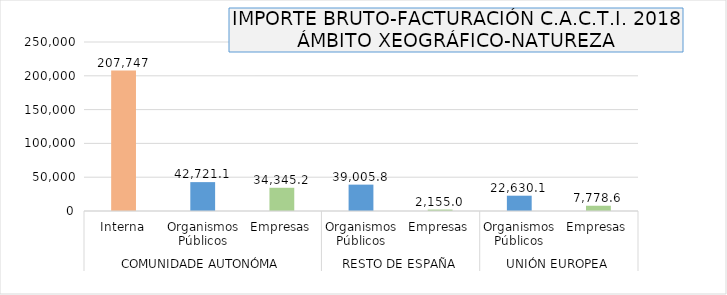
| Category | Series 0 |
|---|---|
| 0 | 207747 |
| 1 | 42721.083 |
| 2 | 34345.198 |
| 3 | 39005.752 |
| 4 | 2155 |
| 5 | 22630.09 |
| 6 | 7778.6 |